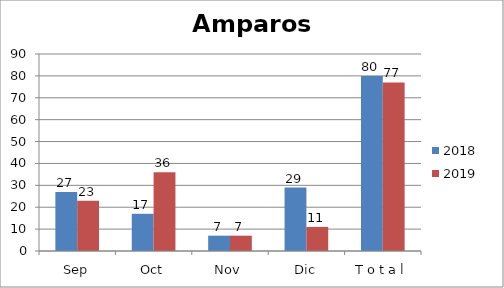
| Category | 2018 | 2019 |
|---|---|---|
| Sep | 27 | 23 |
| Oct | 17 | 36 |
| Nov | 7 | 7 |
| Dic | 29 | 11 |
| T o t a l | 80 | 77 |